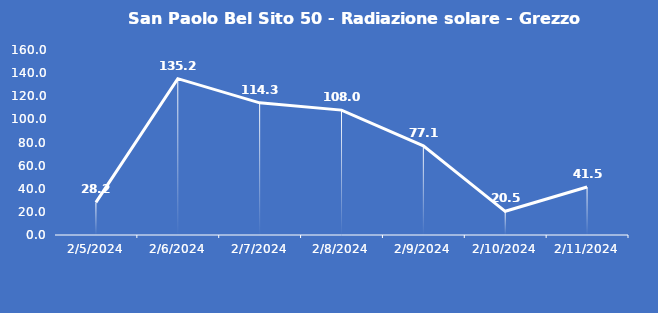
| Category | San Paolo Bel Sito 50 - Radiazione solare - Grezzo (W/m2) |
|---|---|
| 2/5/24 | 28.2 |
| 2/6/24 | 135.2 |
| 2/7/24 | 114.3 |
| 2/8/24 | 108 |
| 2/9/24 | 77.1 |
| 2/10/24 | 20.5 |
| 2/11/24 | 41.5 |